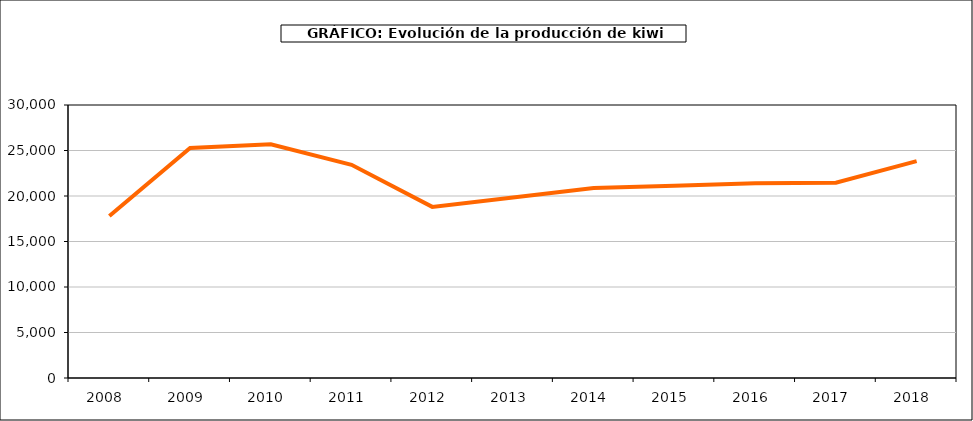
| Category | producción kiwi |
|---|---|
| 2008.0 | 17799 |
| 2009.0 | 25285 |
| 2010.0 | 25676 |
| 2011.0 | 23425 |
| 2012.0 | 18804 |
| 2013.0 | 19834 |
| 2014.0 | 20884 |
| 2015.0 | 21135 |
| 2016.0 | 21409 |
| 2017.0 | 21463 |
| 2018.0 | 23833 |